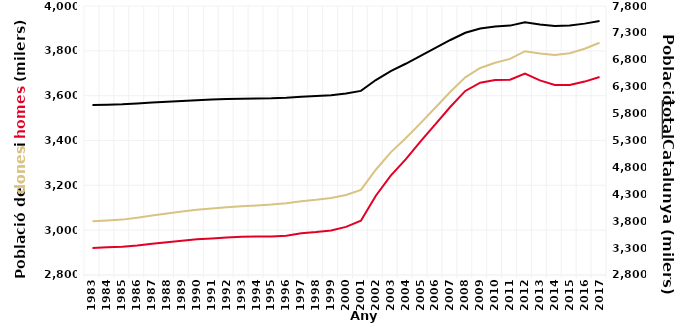
| Category | Dones | Homes |
|---|---|---|
| 1983.0 | 3039659.416 | 2920994.649 |
| 1984.0 | 3043341.214 | 2923280.592 |
| 1985.0 | 3047044.632 | 2925591.471 |
| 1986.0 | 3055431 | 2931256 |
| 1987.0 | 3065276 | 2938971 |
| 1988.0 | 3074506 | 2946062 |
| 1989.0 | 3083253 | 2952730 |
| 1990.0 | 3091370 | 2958944 |
| 1991.0 | 3097024 | 2963309 |
| 1992.0 | 3102108 | 2967463 |
| 1993.0 | 3107157 | 2971162 |
| 1994.0 | 3110462 | 2971651 |
| 1995.0 | 3113970 | 2971472 |
| 1996.0 | 3120331 | 2974854 |
| 1997.0 | 3129081 | 2986201 |
| 1998.0 | 3135497 | 2991644 |
| 1999.0 | 3143403 | 2998854 |
| 2000.0 | 3157143 | 3014796 |
| 2001.0 | 3179413 | 3042317 |
| 2002.0 | 3269566 | 3153757 |
| 2003.0 | 3347237 | 3242996 |
| 2004.0 | 3410329 | 3316066 |
| 2005.0 | 3477392 | 3396257 |
| 2006.0 | 3546967 | 3473240 |
| 2007.0 | 3617696 | 3550658 |
| 2008.0 | 3681769 | 3621097 |
| 2009.0 | 3723510 | 3657812 |
| 2010.0 | 3747094 | 3669953 |
| 2011.0 | 3763928 | 3671394 |
| 2012.0 | 3798501 | 3698717 |
| 2013.0 | 3788155 | 3668236 |
| 2014.0 | 3781612 | 3647691 |
| 2015.0 | 3788987 | 3647573 |
| 2016.0 | 3809519 | 3662772 |
| 2017.0 | 3836279 | 3683602 |